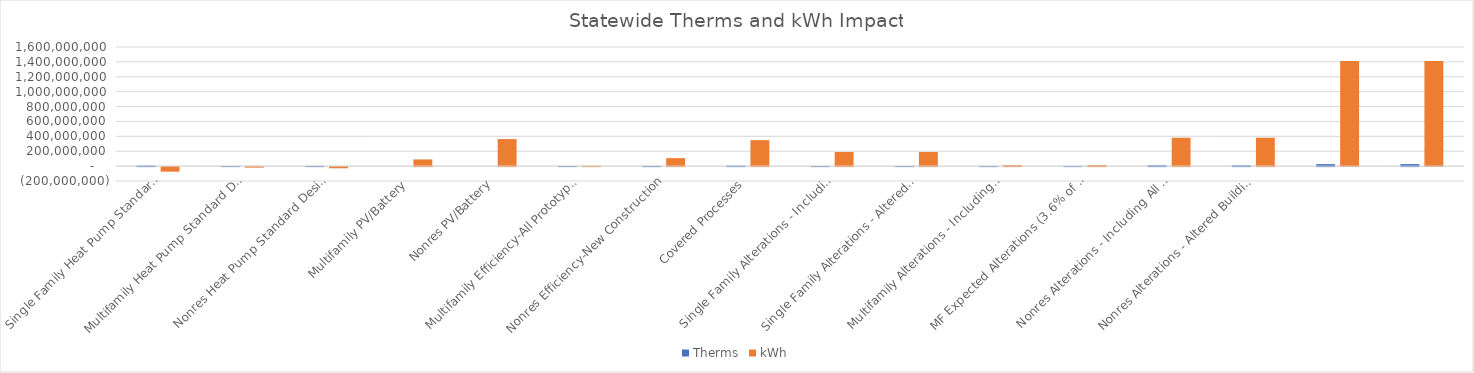
| Category | Therms | kWh |
|---|---|---|
| Single Family Heat Pump Standard Design | 6186177.57 | -61067031.349 |
| Multifamily Heat Pump Standard Design | 696819.961 | -6715355.213 |
| Nonres Heat Pump Standard Design | 2003424.279 | -15451366.74 |
| Multifamily PV/Battery | 0 | 89670588.449 |
| Nonres PV/Battery | 0 | 363116456.211 |
| Multifamily Efficiency-All Prototypes | 420348.443 | 3393407.011 |
| Nonres Efficiency-New Construction | 1621789.855 | 107381502.328 |
| Covered Processes | 5186000 | 348338000 |
|  Single Family Alterations - Including All Existing Buildings  | 701000 | 189720000 |
|  Single Family Alterations - Altered Buildings Only (7% of existing buildings)  | 701000 | 189720000 |
|  Multifamily Alterations - Including All Existing Buildings  | 219112.077 | 13047527.642 |
|  MF Expected Alterations (3.6% of existing buildings)  | 219112.077 | 13047527.642 |
|  Nonres Alterations - Including All Existing Buildings | 9769294.749 | 381396209.718 |
|  Nonres Alterations - Altered Buildings Only (7% of existing buildings)  | 9769294.749 | 381396209.718 |